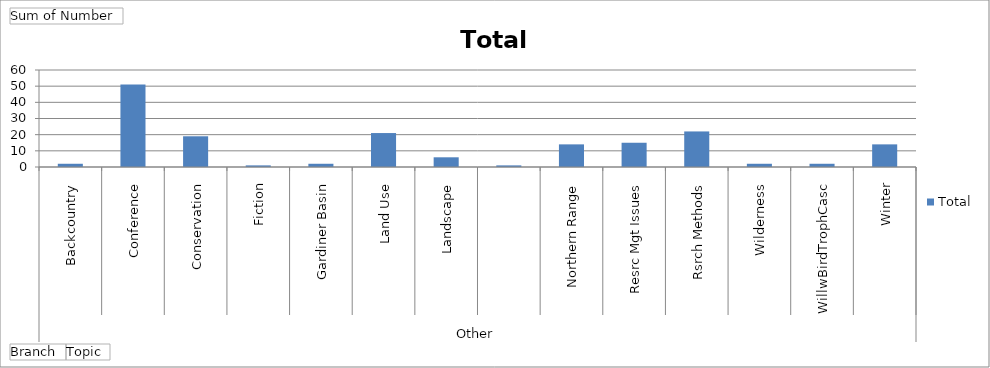
| Category | Total |
|---|---|
| 0 | 2 |
| 1 | 51 |
| 2 | 19 |
| 3 | 1 |
| 4 | 2 |
| 5 | 21 |
| 6 | 6 |
| 7 | 1 |
| 8 | 14 |
| 9 | 15 |
| 10 | 22 |
| 11 | 2 |
| 12 | 2 |
| 13 | 14 |